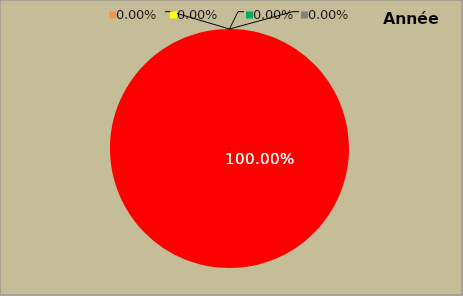
| Category | Series 0 |
|---|---|
| Mesures non appliquées | 168 |
| Mesures appliquées mais peu ou pas documentées | 0 |
| Mesures appliquées et documentées | 0 |
| Mesures appliquées, documentées et contrôlées | 0 |
| Mesures non applicables | 0 |